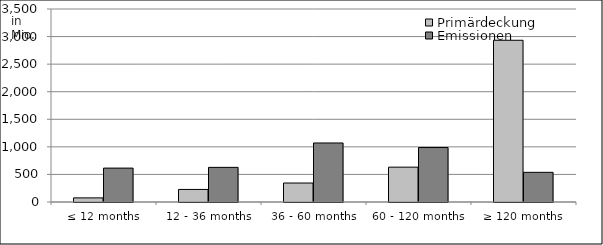
| Category | Primärdeckung | Emissionen |
|---|---|---|
| ≤ 12 months | 74570067.08 | 614718528.474 |
| 12 - 36 months | 227793151.44 | 628101644.14 |
| 36 - 60 months | 344135526.199 | 1070500000 |
| 60 - 120 months | 631848046.36 | 987650000 |
| ≥ 120 months | 2932980924.675 | 537860378.92 |